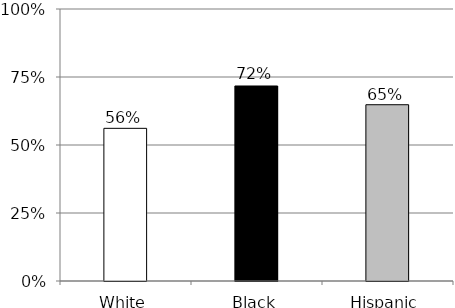
| Category | Series 0 |
|---|---|
| White | 0.561 |
| Black | 0.717 |
| Hispanic | 0.648 |